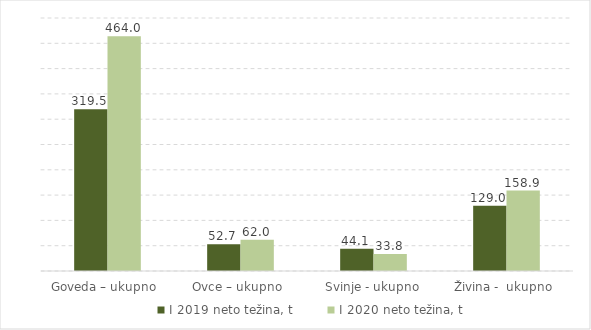
| Category | I 2019 | I 2020 |
|---|---|---|
| Goveda – ukupno  | 319.5 | 464 |
| Ovce – ukupno  | 52.7 | 62 |
| Svinje - ukupno | 44.1 | 33.8 |
| Živina -  ukupno  | 129 | 158.9 |